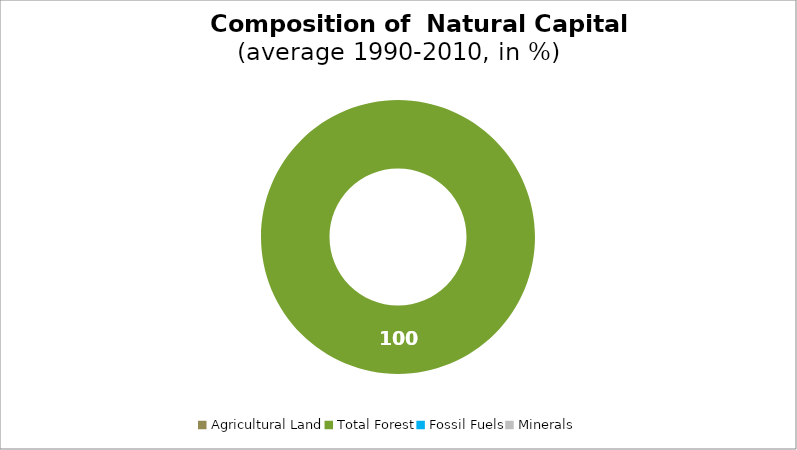
| Category | Series 0 |
|---|---|
| Agricultural Land | 0 |
| Total Forest | 100 |
| Fossil Fuels | 0 |
| Minerals | 0 |